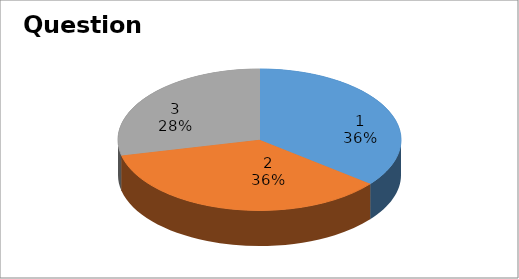
| Category | Series 0 |
|---|---|
| 0 | 5 |
| 1 | 5 |
| 2 | 4 |